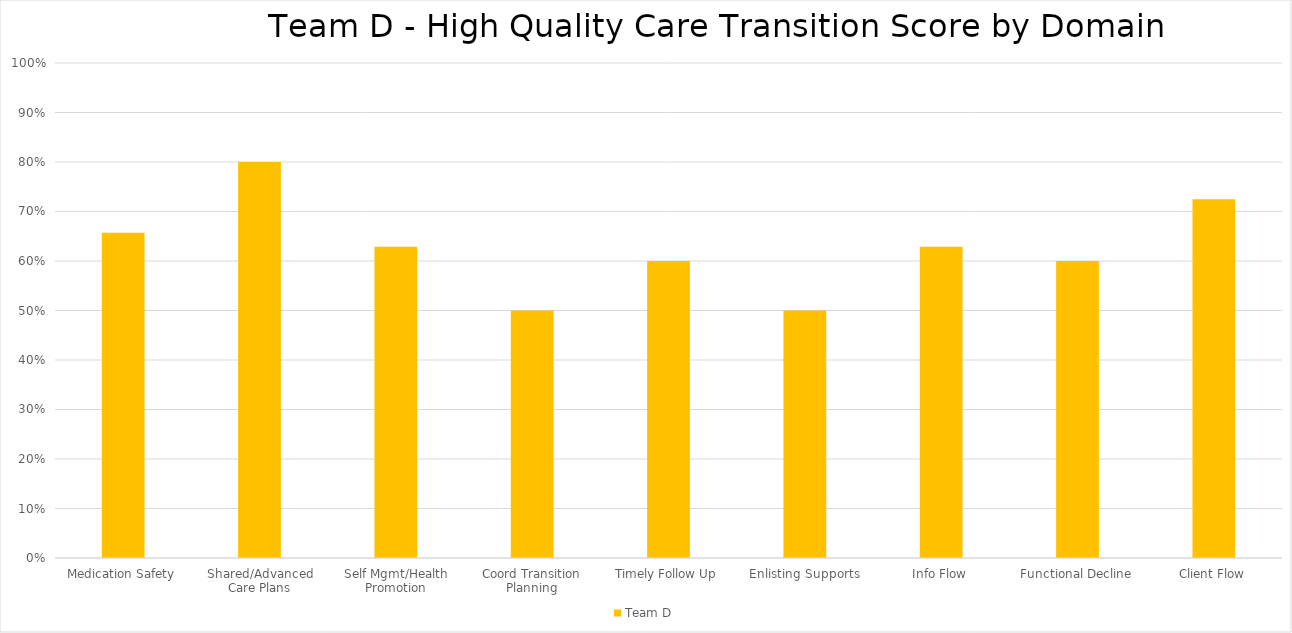
| Category | Team D |
|---|---|
| Medication Safety | 0.657 |
| Shared/Advanced Care Plans | 0.8 |
| Self Mgmt/Health Promotion | 0.629 |
| Coord Transition Planning | 0.5 |
| Timely Follow Up | 0.6 |
| Enlisting Supports | 0.5 |
| Info Flow | 0.629 |
| Functional Decline | 0.6 |
| Client Flow | 0.725 |